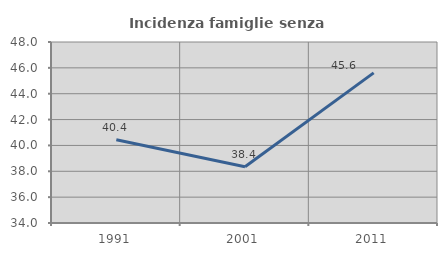
| Category | Incidenza famiglie senza nuclei |
|---|---|
| 1991.0 | 40.44 |
| 2001.0 | 38.355 |
| 2011.0 | 45.612 |